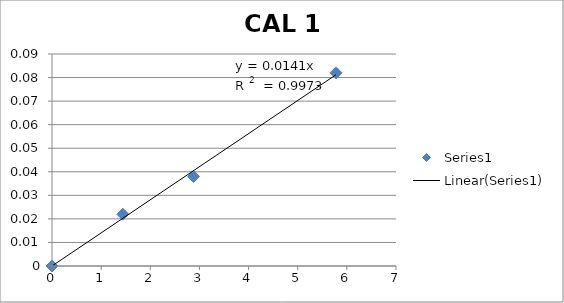
| Category | Series 0 |
|---|---|
| 0.0 | 0 |
| 1.44 | 0.022 |
| 2.88 | 0.038 |
| 5.78 | 0.082 |